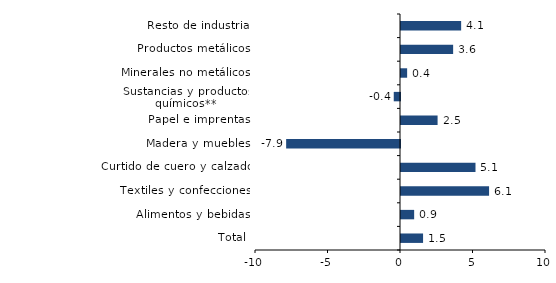
| Category | Series 0 |
|---|---|
| Total | 1.522 |
| Alimentos y bebidas | 0.907 |
| Textiles y confecciones | 6.074 |
| Curtido de cuero y calzado | 5.137 |
| Madera y muebles | -7.852 |
| Papel e imprentas | 2.523 |
| Sustancias y productos químicos** | -0.431 |
| Minerales no metálicos | 0.423 |
| Productos metálicos | 3.596 |
| Resto de industria | 4.148 |